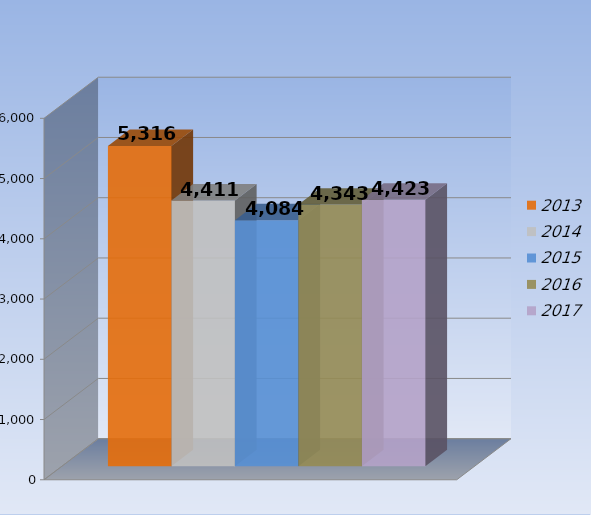
| Category | 2013 | 2014 | 2015 | 2016 | 2017 |
|---|---|---|---|---|---|
| 0 | 5316 | 4411 | 4084 | 4343 | 4423 |